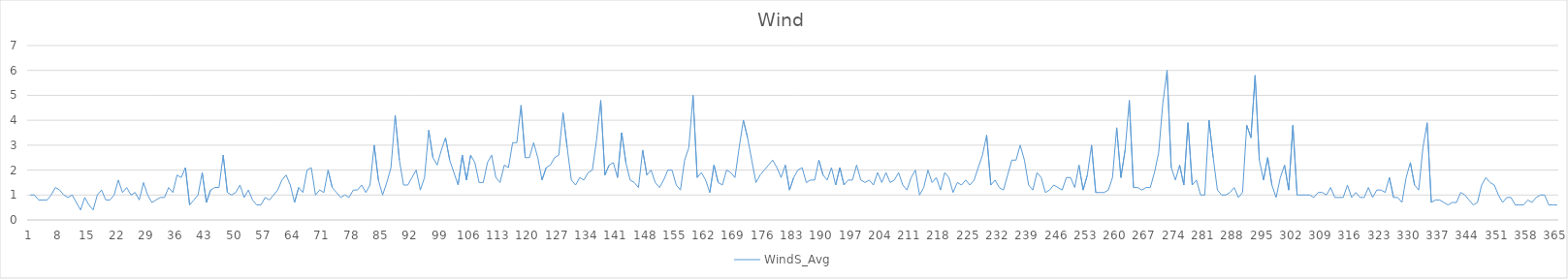
| Category | WindS_Avg |
|---|---|
| 0 | 1 |
| 1 | 1 |
| 2 | 0.8 |
| 3 | 0.8 |
| 4 | 0.8 |
| 5 | 1 |
| 6 | 1.3 |
| 7 | 1.2 |
| 8 | 1 |
| 9 | 0.9 |
| 10 | 1 |
| 11 | 0.7 |
| 12 | 0.4 |
| 13 | 0.9 |
| 14 | 0.6 |
| 15 | 0.4 |
| 16 | 1 |
| 17 | 1.2 |
| 18 | 0.8 |
| 19 | 0.8 |
| 20 | 1 |
| 21 | 1.6 |
| 22 | 1.1 |
| 23 | 1.3 |
| 24 | 1 |
| 25 | 1.1 |
| 26 | 0.8 |
| 27 | 1.5 |
| 28 | 1 |
| 29 | 0.7 |
| 30 | 0.8 |
| 31 | 0.9 |
| 32 | 0.9 |
| 33 | 1.3 |
| 34 | 1.1 |
| 35 | 1.8 |
| 36 | 1.7 |
| 37 | 2.1 |
| 38 | 0.6 |
| 39 | 0.8 |
| 40 | 1 |
| 41 | 1.9 |
| 42 | 0.7 |
| 43 | 1.2 |
| 44 | 1.3 |
| 45 | 1.3 |
| 46 | 2.6 |
| 47 | 1.1 |
| 48 | 1 |
| 49 | 1.1 |
| 50 | 1.4 |
| 51 | 0.9 |
| 52 | 1.2 |
| 53 | 0.8 |
| 54 | 0.6 |
| 55 | 0.6 |
| 56 | 0.9 |
| 57 | 0.8 |
| 58 | 1 |
| 59 | 1.2 |
| 60 | 1.6 |
| 61 | 1.8 |
| 62 | 1.4 |
| 63 | 0.7 |
| 64 | 1.3 |
| 65 | 1.1 |
| 66 | 2 |
| 67 | 2.1 |
| 68 | 1 |
| 69 | 1.2 |
| 70 | 1.1 |
| 71 | 2 |
| 72 | 1.3 |
| 73 | 1.1 |
| 74 | 0.9 |
| 75 | 1 |
| 76 | 0.9 |
| 77 | 1.2 |
| 78 | 1.2 |
| 79 | 1.4 |
| 80 | 1.1 |
| 81 | 1.4 |
| 82 | 3 |
| 83 | 1.6 |
| 84 | 1 |
| 85 | 1.5 |
| 86 | 2.1 |
| 87 | 4.2 |
| 88 | 2.4 |
| 89 | 1.4 |
| 90 | 1.4 |
| 91 | 1.7 |
| 92 | 2 |
| 93 | 1.2 |
| 94 | 1.7 |
| 95 | 3.6 |
| 96 | 2.5 |
| 97 | 2.2 |
| 98 | 2.8 |
| 99 | 3.3 |
| 100 | 2.4 |
| 101 | 1.9 |
| 102 | 1.4 |
| 103 | 2.6 |
| 104 | 1.6 |
| 105 | 2.6 |
| 106 | 2.3 |
| 107 | 1.5 |
| 108 | 1.5 |
| 109 | 2.3 |
| 110 | 2.6 |
| 111 | 1.7 |
| 112 | 1.5 |
| 113 | 2.2 |
| 114 | 2.1 |
| 115 | 3.1 |
| 116 | 3.1 |
| 117 | 4.6 |
| 118 | 2.5 |
| 119 | 2.5 |
| 120 | 3.1 |
| 121 | 2.5 |
| 122 | 1.6 |
| 123 | 2.1 |
| 124 | 2.2 |
| 125 | 2.5 |
| 126 | 2.6 |
| 127 | 4.3 |
| 128 | 2.9 |
| 129 | 1.6 |
| 130 | 1.4 |
| 131 | 1.7 |
| 132 | 1.6 |
| 133 | 1.9 |
| 134 | 2 |
| 135 | 3.2 |
| 136 | 4.8 |
| 137 | 1.8 |
| 138 | 2.2 |
| 139 | 2.3 |
| 140 | 1.7 |
| 141 | 3.5 |
| 142 | 2.3 |
| 143 | 1.6 |
| 144 | 1.5 |
| 145 | 1.3 |
| 146 | 2.8 |
| 147 | 1.8 |
| 148 | 2 |
| 149 | 1.5 |
| 150 | 1.3 |
| 151 | 1.6 |
| 152 | 2 |
| 153 | 2 |
| 154 | 1.4 |
| 155 | 1.2 |
| 156 | 2.4 |
| 157 | 2.9 |
| 158 | 5 |
| 159 | 1.7 |
| 160 | 1.9 |
| 161 | 1.6 |
| 162 | 1.1 |
| 163 | 2.2 |
| 164 | 1.5 |
| 165 | 1.4 |
| 166 | 2 |
| 167 | 1.9 |
| 168 | 1.7 |
| 169 | 2.9 |
| 170 | 4 |
| 171 | 3.3 |
| 172 | 2.4 |
| 173 | 1.5 |
| 174 | 1.8 |
| 175 | 2 |
| 176 | 2.2 |
| 177 | 2.4 |
| 178 | 2.1 |
| 179 | 1.7 |
| 180 | 2.2 |
| 181 | 1.2 |
| 182 | 1.7 |
| 183 | 2 |
| 184 | 2.1 |
| 185 | 1.5 |
| 186 | 1.6 |
| 187 | 1.6 |
| 188 | 2.4 |
| 189 | 1.8 |
| 190 | 1.6 |
| 191 | 2.1 |
| 192 | 1.4 |
| 193 | 2.1 |
| 194 | 1.4 |
| 195 | 1.6 |
| 196 | 1.6 |
| 197 | 2.2 |
| 198 | 1.6 |
| 199 | 1.5 |
| 200 | 1.6 |
| 201 | 1.4 |
| 202 | 1.9 |
| 203 | 1.5 |
| 204 | 1.9 |
| 205 | 1.5 |
| 206 | 1.6 |
| 207 | 1.9 |
| 208 | 1.4 |
| 209 | 1.2 |
| 210 | 1.7 |
| 211 | 2 |
| 212 | 1 |
| 213 | 1.3 |
| 214 | 2 |
| 215 | 1.5 |
| 216 | 1.7 |
| 217 | 1.2 |
| 218 | 1.9 |
| 219 | 1.7 |
| 220 | 1.1 |
| 221 | 1.5 |
| 222 | 1.4 |
| 223 | 1.6 |
| 224 | 1.4 |
| 225 | 1.6 |
| 226 | 2.1 |
| 227 | 2.6 |
| 228 | 3.4 |
| 229 | 1.4 |
| 230 | 1.6 |
| 231 | 1.3 |
| 232 | 1.2 |
| 233 | 1.8 |
| 234 | 2.4 |
| 235 | 2.4 |
| 236 | 3 |
| 237 | 2.4 |
| 238 | 1.4 |
| 239 | 1.2 |
| 240 | 1.9 |
| 241 | 1.7 |
| 242 | 1.1 |
| 243 | 1.2 |
| 244 | 1.4 |
| 245 | 1.3 |
| 246 | 1.2 |
| 247 | 1.7 |
| 248 | 1.7 |
| 249 | 1.3 |
| 250 | 2.2 |
| 251 | 1.2 |
| 252 | 1.8 |
| 253 | 3 |
| 254 | 1.1 |
| 255 | 1.1 |
| 256 | 1.1 |
| 257 | 1.2 |
| 258 | 1.7 |
| 259 | 3.7 |
| 260 | 1.7 |
| 261 | 2.8 |
| 262 | 4.8 |
| 263 | 1.3 |
| 264 | 1.3 |
| 265 | 1.2 |
| 266 | 1.3 |
| 267 | 1.3 |
| 268 | 1.9 |
| 269 | 2.7 |
| 270 | 4.7 |
| 271 | 6 |
| 272 | 2.1 |
| 273 | 1.6 |
| 274 | 2.2 |
| 275 | 1.4 |
| 276 | 3.9 |
| 277 | 1.4 |
| 278 | 1.6 |
| 279 | 1 |
| 280 | 1 |
| 281 | 4 |
| 282 | 2.5 |
| 283 | 1.2 |
| 284 | 1 |
| 285 | 1 |
| 286 | 1.1 |
| 287 | 1.3 |
| 288 | 0.9 |
| 289 | 1.1 |
| 290 | 3.8 |
| 291 | 3.3 |
| 292 | 5.8 |
| 293 | 2.4 |
| 294 | 1.6 |
| 295 | 2.5 |
| 296 | 1.4 |
| 297 | 0.9 |
| 298 | 1.7 |
| 299 | 2.2 |
| 300 | 1.2 |
| 301 | 3.8 |
| 302 | 1 |
| 303 | 1 |
| 304 | 1 |
| 305 | 1 |
| 306 | 0.9 |
| 307 | 1.1 |
| 308 | 1.1 |
| 309 | 1 |
| 310 | 1.3 |
| 311 | 0.9 |
| 312 | 0.9 |
| 313 | 0.9 |
| 314 | 1.4 |
| 315 | 0.9 |
| 316 | 1.1 |
| 317 | 0.9 |
| 318 | 0.9 |
| 319 | 1.3 |
| 320 | 0.9 |
| 321 | 1.2 |
| 322 | 1.2 |
| 323 | 1.1 |
| 324 | 1.7 |
| 325 | 0.9 |
| 326 | 0.9 |
| 327 | 0.7 |
| 328 | 1.7 |
| 329 | 2.3 |
| 330 | 1.4 |
| 331 | 1.2 |
| 332 | 2.9 |
| 333 | 3.9 |
| 334 | 0.7 |
| 335 | 0.8 |
| 336 | 0.8 |
| 337 | 0.7 |
| 338 | 0.6 |
| 339 | 0.7 |
| 340 | 0.7 |
| 341 | 1.1 |
| 342 | 1 |
| 343 | 0.8 |
| 344 | 0.6 |
| 345 | 0.7 |
| 346 | 1.4 |
| 347 | 1.7 |
| 348 | 1.5 |
| 349 | 1.4 |
| 350 | 1 |
| 351 | 0.7 |
| 352 | 0.9 |
| 353 | 0.9 |
| 354 | 0.6 |
| 355 | 0.6 |
| 356 | 0.6 |
| 357 | 0.8 |
| 358 | 0.7 |
| 359 | 0.9 |
| 360 | 1 |
| 361 | 1 |
| 362 | 0.6 |
| 363 | 0.6 |
| 364 | 0.6 |